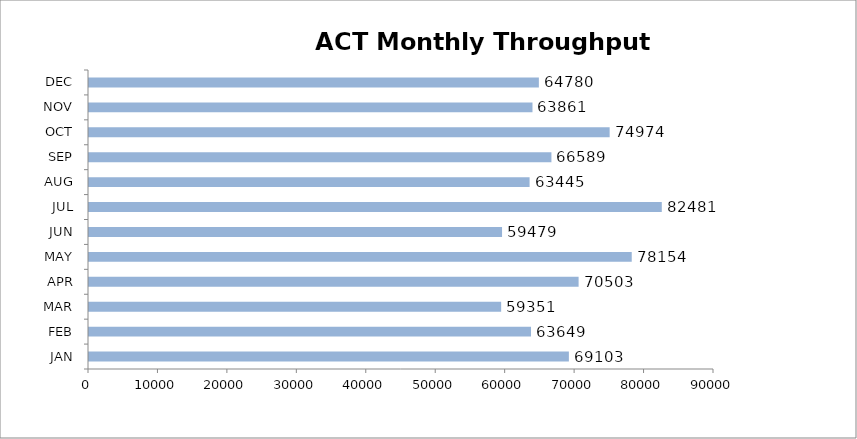
| Category | Monthly Throughput 2018 |
|---|---|
| JAN | 69103 |
| FEB | 63649 |
| MAR | 59351 |
| APR | 70503 |
| MAY | 78154 |
| JUN | 59479 |
| JUL | 82481 |
| AUG | 63445 |
| SEP | 66589 |
| OCT | 74974 |
| NOV | 63861 |
| DEC | 64780 |